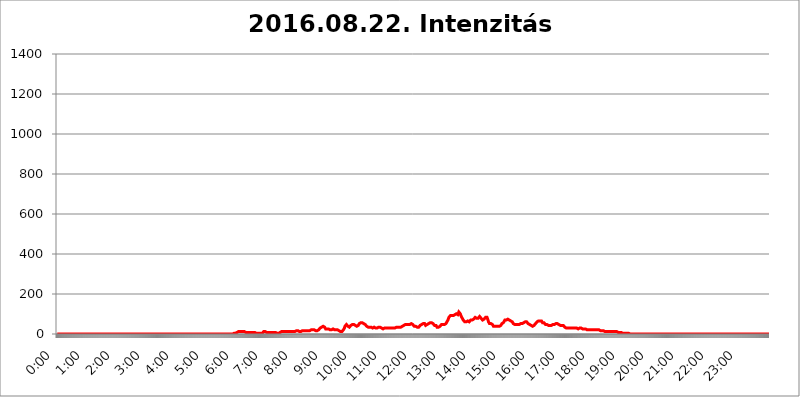
| Category | 2016.08.22. Intenzitás [W/m^2] |
|---|---|
| 0.0 | 0 |
| 0.0006944444444444445 | 0 |
| 0.001388888888888889 | 0 |
| 0.0020833333333333333 | 0 |
| 0.002777777777777778 | 0 |
| 0.003472222222222222 | 0 |
| 0.004166666666666667 | 0 |
| 0.004861111111111111 | 0 |
| 0.005555555555555556 | 0 |
| 0.0062499999999999995 | 0 |
| 0.006944444444444444 | 0 |
| 0.007638888888888889 | 0 |
| 0.008333333333333333 | 0 |
| 0.009027777777777779 | 0 |
| 0.009722222222222222 | 0 |
| 0.010416666666666666 | 0 |
| 0.011111111111111112 | 0 |
| 0.011805555555555555 | 0 |
| 0.012499999999999999 | 0 |
| 0.013194444444444444 | 0 |
| 0.013888888888888888 | 0 |
| 0.014583333333333332 | 0 |
| 0.015277777777777777 | 0 |
| 0.015972222222222224 | 0 |
| 0.016666666666666666 | 0 |
| 0.017361111111111112 | 0 |
| 0.018055555555555557 | 0 |
| 0.01875 | 0 |
| 0.019444444444444445 | 0 |
| 0.02013888888888889 | 0 |
| 0.020833333333333332 | 0 |
| 0.02152777777777778 | 0 |
| 0.022222222222222223 | 0 |
| 0.02291666666666667 | 0 |
| 0.02361111111111111 | 0 |
| 0.024305555555555556 | 0 |
| 0.024999999999999998 | 0 |
| 0.025694444444444447 | 0 |
| 0.02638888888888889 | 0 |
| 0.027083333333333334 | 0 |
| 0.027777777777777776 | 0 |
| 0.02847222222222222 | 0 |
| 0.029166666666666664 | 0 |
| 0.029861111111111113 | 0 |
| 0.030555555555555555 | 0 |
| 0.03125 | 0 |
| 0.03194444444444445 | 0 |
| 0.03263888888888889 | 0 |
| 0.03333333333333333 | 0 |
| 0.034027777777777775 | 0 |
| 0.034722222222222224 | 0 |
| 0.035416666666666666 | 0 |
| 0.036111111111111115 | 0 |
| 0.03680555555555556 | 0 |
| 0.0375 | 0 |
| 0.03819444444444444 | 0 |
| 0.03888888888888889 | 0 |
| 0.03958333333333333 | 0 |
| 0.04027777777777778 | 0 |
| 0.04097222222222222 | 0 |
| 0.041666666666666664 | 0 |
| 0.042361111111111106 | 0 |
| 0.04305555555555556 | 0 |
| 0.043750000000000004 | 0 |
| 0.044444444444444446 | 0 |
| 0.04513888888888889 | 0 |
| 0.04583333333333334 | 0 |
| 0.04652777777777778 | 0 |
| 0.04722222222222222 | 0 |
| 0.04791666666666666 | 0 |
| 0.04861111111111111 | 0 |
| 0.049305555555555554 | 0 |
| 0.049999999999999996 | 0 |
| 0.05069444444444445 | 0 |
| 0.051388888888888894 | 0 |
| 0.052083333333333336 | 0 |
| 0.05277777777777778 | 0 |
| 0.05347222222222222 | 0 |
| 0.05416666666666667 | 0 |
| 0.05486111111111111 | 0 |
| 0.05555555555555555 | 0 |
| 0.05625 | 0 |
| 0.05694444444444444 | 0 |
| 0.057638888888888885 | 0 |
| 0.05833333333333333 | 0 |
| 0.05902777777777778 | 0 |
| 0.059722222222222225 | 0 |
| 0.06041666666666667 | 0 |
| 0.061111111111111116 | 0 |
| 0.06180555555555556 | 0 |
| 0.0625 | 0 |
| 0.06319444444444444 | 0 |
| 0.06388888888888888 | 0 |
| 0.06458333333333334 | 0 |
| 0.06527777777777778 | 0 |
| 0.06597222222222222 | 0 |
| 0.06666666666666667 | 0 |
| 0.06736111111111111 | 0 |
| 0.06805555555555555 | 0 |
| 0.06874999999999999 | 0 |
| 0.06944444444444443 | 0 |
| 0.07013888888888889 | 0 |
| 0.07083333333333333 | 0 |
| 0.07152777777777779 | 0 |
| 0.07222222222222223 | 0 |
| 0.07291666666666667 | 0 |
| 0.07361111111111111 | 0 |
| 0.07430555555555556 | 0 |
| 0.075 | 0 |
| 0.07569444444444444 | 0 |
| 0.0763888888888889 | 0 |
| 0.07708333333333334 | 0 |
| 0.07777777777777778 | 0 |
| 0.07847222222222222 | 0 |
| 0.07916666666666666 | 0 |
| 0.0798611111111111 | 0 |
| 0.08055555555555556 | 0 |
| 0.08125 | 0 |
| 0.08194444444444444 | 0 |
| 0.08263888888888889 | 0 |
| 0.08333333333333333 | 0 |
| 0.08402777777777777 | 0 |
| 0.08472222222222221 | 0 |
| 0.08541666666666665 | 0 |
| 0.08611111111111112 | 0 |
| 0.08680555555555557 | 0 |
| 0.08750000000000001 | 0 |
| 0.08819444444444445 | 0 |
| 0.08888888888888889 | 0 |
| 0.08958333333333333 | 0 |
| 0.09027777777777778 | 0 |
| 0.09097222222222222 | 0 |
| 0.09166666666666667 | 0 |
| 0.09236111111111112 | 0 |
| 0.09305555555555556 | 0 |
| 0.09375 | 0 |
| 0.09444444444444444 | 0 |
| 0.09513888888888888 | 0 |
| 0.09583333333333333 | 0 |
| 0.09652777777777777 | 0 |
| 0.09722222222222222 | 0 |
| 0.09791666666666667 | 0 |
| 0.09861111111111111 | 0 |
| 0.09930555555555555 | 0 |
| 0.09999999999999999 | 0 |
| 0.10069444444444443 | 0 |
| 0.1013888888888889 | 0 |
| 0.10208333333333335 | 0 |
| 0.10277777777777779 | 0 |
| 0.10347222222222223 | 0 |
| 0.10416666666666667 | 0 |
| 0.10486111111111111 | 0 |
| 0.10555555555555556 | 0 |
| 0.10625 | 0 |
| 0.10694444444444444 | 0 |
| 0.1076388888888889 | 0 |
| 0.10833333333333334 | 0 |
| 0.10902777777777778 | 0 |
| 0.10972222222222222 | 0 |
| 0.1111111111111111 | 0 |
| 0.11180555555555556 | 0 |
| 0.11180555555555556 | 0 |
| 0.1125 | 0 |
| 0.11319444444444444 | 0 |
| 0.11388888888888889 | 0 |
| 0.11458333333333333 | 0 |
| 0.11527777777777777 | 0 |
| 0.11597222222222221 | 0 |
| 0.11666666666666665 | 0 |
| 0.1173611111111111 | 0 |
| 0.11805555555555557 | 0 |
| 0.11944444444444445 | 0 |
| 0.12013888888888889 | 0 |
| 0.12083333333333333 | 0 |
| 0.12152777777777778 | 0 |
| 0.12222222222222223 | 0 |
| 0.12291666666666667 | 0 |
| 0.12291666666666667 | 0 |
| 0.12361111111111112 | 0 |
| 0.12430555555555556 | 0 |
| 0.125 | 0 |
| 0.12569444444444444 | 0 |
| 0.12638888888888888 | 0 |
| 0.12708333333333333 | 0 |
| 0.16875 | 0 |
| 0.12847222222222224 | 0 |
| 0.12916666666666668 | 0 |
| 0.12986111111111112 | 0 |
| 0.13055555555555556 | 0 |
| 0.13125 | 0 |
| 0.13194444444444445 | 0 |
| 0.1326388888888889 | 0 |
| 0.13333333333333333 | 0 |
| 0.13402777777777777 | 0 |
| 0.13402777777777777 | 0 |
| 0.13472222222222222 | 0 |
| 0.13541666666666666 | 0 |
| 0.1361111111111111 | 0 |
| 0.13749999999999998 | 0 |
| 0.13819444444444443 | 0 |
| 0.1388888888888889 | 0 |
| 0.13958333333333334 | 0 |
| 0.14027777777777778 | 0 |
| 0.14097222222222222 | 0 |
| 0.14166666666666666 | 0 |
| 0.1423611111111111 | 0 |
| 0.14305555555555557 | 0 |
| 0.14375000000000002 | 0 |
| 0.14444444444444446 | 0 |
| 0.1451388888888889 | 0 |
| 0.1451388888888889 | 0 |
| 0.14652777777777778 | 0 |
| 0.14722222222222223 | 0 |
| 0.14791666666666667 | 0 |
| 0.1486111111111111 | 0 |
| 0.14930555555555555 | 0 |
| 0.15 | 0 |
| 0.15069444444444444 | 0 |
| 0.15138888888888888 | 0 |
| 0.15208333333333332 | 0 |
| 0.15277777777777776 | 0 |
| 0.15347222222222223 | 0 |
| 0.15416666666666667 | 0 |
| 0.15486111111111112 | 0 |
| 0.15555555555555556 | 0 |
| 0.15625 | 0 |
| 0.15694444444444444 | 0 |
| 0.15763888888888888 | 0 |
| 0.15833333333333333 | 0 |
| 0.15902777777777777 | 0 |
| 0.15972222222222224 | 0 |
| 0.16041666666666668 | 0 |
| 0.16111111111111112 | 0 |
| 0.16180555555555556 | 0 |
| 0.1625 | 0 |
| 0.16319444444444445 | 0 |
| 0.1638888888888889 | 0 |
| 0.16458333333333333 | 0 |
| 0.16527777777777777 | 0 |
| 0.16597222222222222 | 0 |
| 0.16666666666666666 | 0 |
| 0.1673611111111111 | 0 |
| 0.16805555555555554 | 0 |
| 0.16874999999999998 | 0 |
| 0.16944444444444443 | 0 |
| 0.17013888888888887 | 0 |
| 0.1708333333333333 | 0 |
| 0.17152777777777775 | 0 |
| 0.17222222222222225 | 0 |
| 0.1729166666666667 | 0 |
| 0.17361111111111113 | 0 |
| 0.17430555555555557 | 0 |
| 0.17500000000000002 | 0 |
| 0.17569444444444446 | 0 |
| 0.1763888888888889 | 0 |
| 0.17708333333333334 | 0 |
| 0.17777777777777778 | 0 |
| 0.17847222222222223 | 0 |
| 0.17916666666666667 | 0 |
| 0.1798611111111111 | 0 |
| 0.18055555555555555 | 0 |
| 0.18125 | 0 |
| 0.18194444444444444 | 0 |
| 0.1826388888888889 | 0 |
| 0.18333333333333335 | 0 |
| 0.1840277777777778 | 0 |
| 0.18472222222222223 | 0 |
| 0.18541666666666667 | 0 |
| 0.18611111111111112 | 0 |
| 0.18680555555555556 | 0 |
| 0.1875 | 0 |
| 0.18819444444444444 | 0 |
| 0.18888888888888888 | 0 |
| 0.18958333333333333 | 0 |
| 0.19027777777777777 | 0 |
| 0.1909722222222222 | 0 |
| 0.19166666666666665 | 0 |
| 0.19236111111111112 | 0 |
| 0.19305555555555554 | 0 |
| 0.19375 | 0 |
| 0.19444444444444445 | 0 |
| 0.1951388888888889 | 0 |
| 0.19583333333333333 | 0 |
| 0.19652777777777777 | 0 |
| 0.19722222222222222 | 0 |
| 0.19791666666666666 | 0 |
| 0.1986111111111111 | 0 |
| 0.19930555555555554 | 0 |
| 0.19999999999999998 | 0 |
| 0.20069444444444443 | 0 |
| 0.20138888888888887 | 0 |
| 0.2020833333333333 | 0 |
| 0.2027777777777778 | 0 |
| 0.2034722222222222 | 0 |
| 0.2041666666666667 | 0 |
| 0.20486111111111113 | 0 |
| 0.20555555555555557 | 0 |
| 0.20625000000000002 | 0 |
| 0.20694444444444446 | 0 |
| 0.2076388888888889 | 0 |
| 0.20833333333333334 | 0 |
| 0.20902777777777778 | 0 |
| 0.20972222222222223 | 0 |
| 0.21041666666666667 | 0 |
| 0.2111111111111111 | 0 |
| 0.21180555555555555 | 0 |
| 0.2125 | 0 |
| 0.21319444444444444 | 0 |
| 0.2138888888888889 | 0 |
| 0.21458333333333335 | 0 |
| 0.2152777777777778 | 0 |
| 0.21597222222222223 | 0 |
| 0.21666666666666667 | 0 |
| 0.21736111111111112 | 0 |
| 0.21805555555555556 | 0 |
| 0.21875 | 0 |
| 0.21944444444444444 | 0 |
| 0.22013888888888888 | 0 |
| 0.22083333333333333 | 0 |
| 0.22152777777777777 | 0 |
| 0.2222222222222222 | 0 |
| 0.22291666666666665 | 0 |
| 0.2236111111111111 | 0 |
| 0.22430555555555556 | 0 |
| 0.225 | 0 |
| 0.22569444444444445 | 0 |
| 0.2263888888888889 | 0 |
| 0.22708333333333333 | 0 |
| 0.22777777777777777 | 0 |
| 0.22847222222222222 | 0 |
| 0.22916666666666666 | 0 |
| 0.2298611111111111 | 0 |
| 0.23055555555555554 | 0 |
| 0.23124999999999998 | 0 |
| 0.23194444444444443 | 0 |
| 0.23263888888888887 | 0 |
| 0.2333333333333333 | 0 |
| 0.2340277777777778 | 0 |
| 0.2347222222222222 | 0 |
| 0.2354166666666667 | 0 |
| 0.23611111111111113 | 0 |
| 0.23680555555555557 | 0 |
| 0.23750000000000002 | 0 |
| 0.23819444444444446 | 0 |
| 0.2388888888888889 | 0 |
| 0.23958333333333334 | 0 |
| 0.24027777777777778 | 0 |
| 0.24097222222222223 | 0 |
| 0.24166666666666667 | 0 |
| 0.2423611111111111 | 0 |
| 0.24305555555555555 | 0 |
| 0.24375 | 0 |
| 0.24444444444444446 | 0 |
| 0.24513888888888888 | 0 |
| 0.24583333333333335 | 0 |
| 0.2465277777777778 | 3.525 |
| 0.24722222222222223 | 3.525 |
| 0.24791666666666667 | 3.525 |
| 0.24861111111111112 | 3.525 |
| 0.24930555555555556 | 3.525 |
| 0.25 | 3.525 |
| 0.25069444444444444 | 7.887 |
| 0.2513888888888889 | 7.887 |
| 0.2520833333333333 | 7.887 |
| 0.25277777777777777 | 7.887 |
| 0.2534722222222222 | 7.887 |
| 0.25416666666666665 | 12.257 |
| 0.2548611111111111 | 12.257 |
| 0.2555555555555556 | 12.257 |
| 0.25625000000000003 | 12.257 |
| 0.2569444444444445 | 12.257 |
| 0.2576388888888889 | 12.257 |
| 0.25833333333333336 | 12.257 |
| 0.2590277777777778 | 12.257 |
| 0.25972222222222224 | 12.257 |
| 0.2604166666666667 | 12.257 |
| 0.2611111111111111 | 12.257 |
| 0.26180555555555557 | 12.257 |
| 0.2625 | 12.257 |
| 0.26319444444444445 | 12.257 |
| 0.2638888888888889 | 7.887 |
| 0.26458333333333334 | 7.887 |
| 0.2652777777777778 | 7.887 |
| 0.2659722222222222 | 7.887 |
| 0.26666666666666666 | 7.887 |
| 0.2673611111111111 | 3.525 |
| 0.26805555555555555 | 7.887 |
| 0.26875 | 7.887 |
| 0.26944444444444443 | 7.887 |
| 0.2701388888888889 | 7.887 |
| 0.2708333333333333 | 7.887 |
| 0.27152777777777776 | 7.887 |
| 0.2722222222222222 | 7.887 |
| 0.27291666666666664 | 7.887 |
| 0.2736111111111111 | 7.887 |
| 0.2743055555555555 | 7.887 |
| 0.27499999999999997 | 7.887 |
| 0.27569444444444446 | 7.887 |
| 0.27638888888888885 | 7.887 |
| 0.27708333333333335 | 7.887 |
| 0.2777777777777778 | 7.887 |
| 0.27847222222222223 | 7.887 |
| 0.2791666666666667 | 3.525 |
| 0.2798611111111111 | 3.525 |
| 0.28055555555555556 | 3.525 |
| 0.28125 | 3.525 |
| 0.28194444444444444 | 3.525 |
| 0.2826388888888889 | 3.525 |
| 0.2833333333333333 | 3.525 |
| 0.28402777777777777 | 3.525 |
| 0.2847222222222222 | 3.525 |
| 0.28541666666666665 | 3.525 |
| 0.28611111111111115 | 3.525 |
| 0.28680555555555554 | 3.525 |
| 0.28750000000000003 | 3.525 |
| 0.2881944444444445 | 7.887 |
| 0.2888888888888889 | 7.887 |
| 0.28958333333333336 | 12.257 |
| 0.2902777777777778 | 12.257 |
| 0.29097222222222224 | 12.257 |
| 0.2916666666666667 | 12.257 |
| 0.2923611111111111 | 7.887 |
| 0.29305555555555557 | 7.887 |
| 0.29375 | 7.887 |
| 0.29444444444444445 | 7.887 |
| 0.2951388888888889 | 7.887 |
| 0.29583333333333334 | 7.887 |
| 0.2965277777777778 | 7.887 |
| 0.2972222222222222 | 7.887 |
| 0.29791666666666666 | 7.887 |
| 0.2986111111111111 | 3.525 |
| 0.29930555555555555 | 7.887 |
| 0.3 | 7.887 |
| 0.30069444444444443 | 7.887 |
| 0.3013888888888889 | 7.887 |
| 0.3020833333333333 | 7.887 |
| 0.30277777777777776 | 7.887 |
| 0.3034722222222222 | 7.887 |
| 0.30416666666666664 | 7.887 |
| 0.3048611111111111 | 7.887 |
| 0.3055555555555555 | 7.887 |
| 0.30624999999999997 | 7.887 |
| 0.3069444444444444 | 3.525 |
| 0.3076388888888889 | 3.525 |
| 0.30833333333333335 | 3.525 |
| 0.3090277777777778 | 3.525 |
| 0.30972222222222223 | 3.525 |
| 0.3104166666666667 | 3.525 |
| 0.3111111111111111 | 3.525 |
| 0.31180555555555556 | 7.887 |
| 0.3125 | 7.887 |
| 0.31319444444444444 | 7.887 |
| 0.3138888888888889 | 7.887 |
| 0.3145833333333333 | 12.257 |
| 0.31527777777777777 | 12.257 |
| 0.3159722222222222 | 12.257 |
| 0.31666666666666665 | 12.257 |
| 0.31736111111111115 | 12.257 |
| 0.31805555555555554 | 12.257 |
| 0.31875000000000003 | 12.257 |
| 0.3194444444444445 | 12.257 |
| 0.3201388888888889 | 12.257 |
| 0.32083333333333336 | 12.257 |
| 0.3215277777777778 | 12.257 |
| 0.32222222222222224 | 12.257 |
| 0.3229166666666667 | 12.257 |
| 0.3236111111111111 | 12.257 |
| 0.32430555555555557 | 12.257 |
| 0.325 | 12.257 |
| 0.32569444444444445 | 12.257 |
| 0.3263888888888889 | 12.257 |
| 0.32708333333333334 | 12.257 |
| 0.3277777777777778 | 12.257 |
| 0.3284722222222222 | 12.257 |
| 0.32916666666666666 | 12.257 |
| 0.3298611111111111 | 12.257 |
| 0.33055555555555555 | 12.257 |
| 0.33125 | 12.257 |
| 0.33194444444444443 | 12.257 |
| 0.3326388888888889 | 12.257 |
| 0.3333333333333333 | 12.257 |
| 0.3340277777777778 | 12.257 |
| 0.3347222222222222 | 12.257 |
| 0.3354166666666667 | 16.636 |
| 0.3361111111111111 | 16.636 |
| 0.3368055555555556 | 16.636 |
| 0.33749999999999997 | 16.636 |
| 0.33819444444444446 | 16.636 |
| 0.33888888888888885 | 12.257 |
| 0.33958333333333335 | 12.257 |
| 0.34027777777777773 | 12.257 |
| 0.34097222222222223 | 12.257 |
| 0.3416666666666666 | 12.257 |
| 0.3423611111111111 | 12.257 |
| 0.3430555555555555 | 16.636 |
| 0.34375 | 16.636 |
| 0.3444444444444445 | 16.636 |
| 0.3451388888888889 | 16.636 |
| 0.3458333333333334 | 16.636 |
| 0.34652777777777777 | 16.636 |
| 0.34722222222222227 | 16.636 |
| 0.34791666666666665 | 16.636 |
| 0.34861111111111115 | 16.636 |
| 0.34930555555555554 | 16.636 |
| 0.35000000000000003 | 16.636 |
| 0.3506944444444444 | 16.636 |
| 0.3513888888888889 | 16.636 |
| 0.3520833333333333 | 16.636 |
| 0.3527777777777778 | 16.636 |
| 0.3534722222222222 | 16.636 |
| 0.3541666666666667 | 16.636 |
| 0.3548611111111111 | 16.636 |
| 0.35555555555555557 | 21.024 |
| 0.35625 | 21.024 |
| 0.35694444444444445 | 21.024 |
| 0.3576388888888889 | 21.024 |
| 0.35833333333333334 | 21.024 |
| 0.3590277777777778 | 21.024 |
| 0.3597222222222222 | 21.024 |
| 0.36041666666666666 | 21.024 |
| 0.3611111111111111 | 21.024 |
| 0.36180555555555555 | 21.024 |
| 0.3625 | 16.636 |
| 0.36319444444444443 | 16.636 |
| 0.3638888888888889 | 16.636 |
| 0.3645833333333333 | 16.636 |
| 0.3652777777777778 | 16.636 |
| 0.3659722222222222 | 21.024 |
| 0.3666666666666667 | 21.024 |
| 0.3673611111111111 | 25.419 |
| 0.3680555555555556 | 25.419 |
| 0.36874999999999997 | 29.823 |
| 0.36944444444444446 | 29.823 |
| 0.37013888888888885 | 29.823 |
| 0.37083333333333335 | 34.234 |
| 0.37152777777777773 | 34.234 |
| 0.37222222222222223 | 34.234 |
| 0.3729166666666666 | 38.653 |
| 0.3736111111111111 | 38.653 |
| 0.3743055555555555 | 34.234 |
| 0.375 | 34.234 |
| 0.3756944444444445 | 29.823 |
| 0.3763888888888889 | 25.419 |
| 0.3770833333333334 | 25.419 |
| 0.37777777777777777 | 25.419 |
| 0.37847222222222227 | 25.419 |
| 0.37916666666666665 | 25.419 |
| 0.37986111111111115 | 25.419 |
| 0.38055555555555554 | 25.419 |
| 0.38125000000000003 | 21.024 |
| 0.3819444444444444 | 21.024 |
| 0.3826388888888889 | 21.024 |
| 0.3833333333333333 | 21.024 |
| 0.3840277777777778 | 21.024 |
| 0.3847222222222222 | 21.024 |
| 0.3854166666666667 | 25.419 |
| 0.3861111111111111 | 25.419 |
| 0.38680555555555557 | 25.419 |
| 0.3875 | 25.419 |
| 0.38819444444444445 | 21.024 |
| 0.3888888888888889 | 21.024 |
| 0.38958333333333334 | 21.024 |
| 0.3902777777777778 | 21.024 |
| 0.3909722222222222 | 21.024 |
| 0.39166666666666666 | 21.024 |
| 0.3923611111111111 | 21.024 |
| 0.39305555555555555 | 21.024 |
| 0.39375 | 16.636 |
| 0.39444444444444443 | 21.024 |
| 0.3951388888888889 | 16.636 |
| 0.3958333333333333 | 16.636 |
| 0.3965277777777778 | 16.636 |
| 0.3972222222222222 | 12.257 |
| 0.3979166666666667 | 12.257 |
| 0.3986111111111111 | 12.257 |
| 0.3993055555555556 | 12.257 |
| 0.39999999999999997 | 16.636 |
| 0.40069444444444446 | 16.636 |
| 0.40138888888888885 | 21.024 |
| 0.40208333333333335 | 25.419 |
| 0.40277777777777773 | 29.823 |
| 0.40347222222222223 | 38.653 |
| 0.4041666666666666 | 38.653 |
| 0.4048611111111111 | 43.079 |
| 0.4055555555555555 | 47.511 |
| 0.40625 | 47.511 |
| 0.4069444444444445 | 43.079 |
| 0.4076388888888889 | 38.653 |
| 0.4083333333333334 | 38.653 |
| 0.40902777777777777 | 38.653 |
| 0.40972222222222227 | 34.234 |
| 0.41041666666666665 | 34.234 |
| 0.41111111111111115 | 38.653 |
| 0.41180555555555554 | 43.079 |
| 0.41250000000000003 | 43.079 |
| 0.4131944444444444 | 47.511 |
| 0.4138888888888889 | 47.511 |
| 0.4145833333333333 | 47.511 |
| 0.4152777777777778 | 47.511 |
| 0.4159722222222222 | 47.511 |
| 0.4166666666666667 | 43.079 |
| 0.4173611111111111 | 43.079 |
| 0.41805555555555557 | 43.079 |
| 0.41875 | 38.653 |
| 0.41944444444444445 | 38.653 |
| 0.4201388888888889 | 38.653 |
| 0.42083333333333334 | 38.653 |
| 0.4215277777777778 | 43.079 |
| 0.4222222222222222 | 43.079 |
| 0.42291666666666666 | 47.511 |
| 0.4236111111111111 | 51.951 |
| 0.42430555555555555 | 56.398 |
| 0.425 | 56.398 |
| 0.42569444444444443 | 56.398 |
| 0.4263888888888889 | 56.398 |
| 0.4270833333333333 | 56.398 |
| 0.4277777777777778 | 56.398 |
| 0.4284722222222222 | 56.398 |
| 0.4291666666666667 | 51.951 |
| 0.4298611111111111 | 51.951 |
| 0.4305555555555556 | 51.951 |
| 0.43124999999999997 | 47.511 |
| 0.43194444444444446 | 47.511 |
| 0.43263888888888885 | 47.511 |
| 0.43333333333333335 | 43.079 |
| 0.43402777777777773 | 38.653 |
| 0.43472222222222223 | 38.653 |
| 0.4354166666666666 | 34.234 |
| 0.4361111111111111 | 34.234 |
| 0.4368055555555555 | 34.234 |
| 0.4375 | 34.234 |
| 0.4381944444444445 | 34.234 |
| 0.4388888888888889 | 34.234 |
| 0.4395833333333334 | 34.234 |
| 0.44027777777777777 | 34.234 |
| 0.44097222222222227 | 29.823 |
| 0.44166666666666665 | 29.823 |
| 0.44236111111111115 | 29.823 |
| 0.44305555555555554 | 34.234 |
| 0.44375000000000003 | 34.234 |
| 0.4444444444444444 | 34.234 |
| 0.4451388888888889 | 34.234 |
| 0.4458333333333333 | 29.823 |
| 0.4465277777777778 | 29.823 |
| 0.4472222222222222 | 29.823 |
| 0.4479166666666667 | 29.823 |
| 0.4486111111111111 | 29.823 |
| 0.44930555555555557 | 29.823 |
| 0.45 | 34.234 |
| 0.45069444444444445 | 34.234 |
| 0.4513888888888889 | 34.234 |
| 0.45208333333333334 | 34.234 |
| 0.4527777777777778 | 34.234 |
| 0.4534722222222222 | 29.823 |
| 0.45416666666666666 | 29.823 |
| 0.4548611111111111 | 29.823 |
| 0.45555555555555555 | 29.823 |
| 0.45625 | 25.419 |
| 0.45694444444444443 | 25.419 |
| 0.4576388888888889 | 25.419 |
| 0.4583333333333333 | 25.419 |
| 0.4590277777777778 | 29.823 |
| 0.4597222222222222 | 29.823 |
| 0.4604166666666667 | 29.823 |
| 0.4611111111111111 | 29.823 |
| 0.4618055555555556 | 29.823 |
| 0.46249999999999997 | 29.823 |
| 0.46319444444444446 | 29.823 |
| 0.46388888888888885 | 29.823 |
| 0.46458333333333335 | 29.823 |
| 0.46527777777777773 | 29.823 |
| 0.46597222222222223 | 29.823 |
| 0.4666666666666666 | 29.823 |
| 0.4673611111111111 | 29.823 |
| 0.4680555555555555 | 29.823 |
| 0.46875 | 29.823 |
| 0.4694444444444445 | 29.823 |
| 0.4701388888888889 | 29.823 |
| 0.4708333333333334 | 29.823 |
| 0.47152777777777777 | 29.823 |
| 0.47222222222222227 | 29.823 |
| 0.47291666666666665 | 29.823 |
| 0.47361111111111115 | 29.823 |
| 0.47430555555555554 | 34.234 |
| 0.47500000000000003 | 34.234 |
| 0.4756944444444444 | 34.234 |
| 0.4763888888888889 | 34.234 |
| 0.4770833333333333 | 34.234 |
| 0.4777777777777778 | 34.234 |
| 0.4784722222222222 | 34.234 |
| 0.4791666666666667 | 34.234 |
| 0.4798611111111111 | 34.234 |
| 0.48055555555555557 | 34.234 |
| 0.48125 | 34.234 |
| 0.48194444444444445 | 34.234 |
| 0.4826388888888889 | 38.653 |
| 0.48333333333333334 | 38.653 |
| 0.4840277777777778 | 38.653 |
| 0.4847222222222222 | 43.079 |
| 0.48541666666666666 | 43.079 |
| 0.4861111111111111 | 43.079 |
| 0.48680555555555555 | 47.511 |
| 0.4875 | 47.511 |
| 0.48819444444444443 | 47.511 |
| 0.4888888888888889 | 51.951 |
| 0.4895833333333333 | 51.951 |
| 0.4902777777777778 | 47.511 |
| 0.4909722222222222 | 47.511 |
| 0.4916666666666667 | 47.511 |
| 0.4923611111111111 | 47.511 |
| 0.4930555555555556 | 47.511 |
| 0.49374999999999997 | 47.511 |
| 0.49444444444444446 | 47.511 |
| 0.49513888888888885 | 47.511 |
| 0.49583333333333335 | 51.951 |
| 0.49652777777777773 | 51.951 |
| 0.49722222222222223 | 47.511 |
| 0.4979166666666666 | 47.511 |
| 0.4986111111111111 | 47.511 |
| 0.4993055555555555 | 43.079 |
| 0.5 | 43.079 |
| 0.5006944444444444 | 38.653 |
| 0.5013888888888889 | 38.653 |
| 0.5020833333333333 | 38.653 |
| 0.5027777777777778 | 38.653 |
| 0.5034722222222222 | 34.234 |
| 0.5041666666666667 | 34.234 |
| 0.5048611111111111 | 34.234 |
| 0.5055555555555555 | 34.234 |
| 0.50625 | 34.234 |
| 0.5069444444444444 | 34.234 |
| 0.5076388888888889 | 38.653 |
| 0.5083333333333333 | 38.653 |
| 0.5090277777777777 | 43.079 |
| 0.5097222222222222 | 43.079 |
| 0.5104166666666666 | 43.079 |
| 0.5111111111111112 | 47.511 |
| 0.5118055555555555 | 47.511 |
| 0.5125000000000001 | 51.951 |
| 0.5131944444444444 | 51.951 |
| 0.513888888888889 | 56.398 |
| 0.5145833333333333 | 56.398 |
| 0.5152777777777778 | 51.951 |
| 0.5159722222222222 | 47.511 |
| 0.5166666666666667 | 43.079 |
| 0.517361111111111 | 43.079 |
| 0.5180555555555556 | 47.511 |
| 0.5187499999999999 | 47.511 |
| 0.5194444444444445 | 47.511 |
| 0.5201388888888888 | 47.511 |
| 0.5208333333333334 | 51.951 |
| 0.5215277777777778 | 56.398 |
| 0.5222222222222223 | 56.398 |
| 0.5229166666666667 | 56.398 |
| 0.5236111111111111 | 60.85 |
| 0.5243055555555556 | 60.85 |
| 0.525 | 56.398 |
| 0.5256944444444445 | 56.398 |
| 0.5263888888888889 | 51.951 |
| 0.5270833333333333 | 51.951 |
| 0.5277777777777778 | 47.511 |
| 0.5284722222222222 | 47.511 |
| 0.5291666666666667 | 43.079 |
| 0.5298611111111111 | 47.511 |
| 0.5305555555555556 | 43.079 |
| 0.53125 | 43.079 |
| 0.5319444444444444 | 38.653 |
| 0.5326388888888889 | 34.234 |
| 0.5333333333333333 | 34.234 |
| 0.5340277777777778 | 34.234 |
| 0.5347222222222222 | 34.234 |
| 0.5354166666666667 | 34.234 |
| 0.5361111111111111 | 38.653 |
| 0.5368055555555555 | 38.653 |
| 0.5375 | 38.653 |
| 0.5381944444444444 | 43.079 |
| 0.5388888888888889 | 47.511 |
| 0.5395833333333333 | 47.511 |
| 0.5402777777777777 | 47.511 |
| 0.5409722222222222 | 47.511 |
| 0.5416666666666666 | 47.511 |
| 0.5423611111111112 | 47.511 |
| 0.5430555555555555 | 47.511 |
| 0.5437500000000001 | 47.511 |
| 0.5444444444444444 | 51.951 |
| 0.545138888888889 | 51.951 |
| 0.5458333333333333 | 56.398 |
| 0.5465277777777778 | 60.85 |
| 0.5472222222222222 | 65.31 |
| 0.5479166666666667 | 69.775 |
| 0.548611111111111 | 74.246 |
| 0.5493055555555556 | 83.205 |
| 0.5499999999999999 | 87.692 |
| 0.5506944444444445 | 87.692 |
| 0.5513888888888888 | 92.184 |
| 0.5520833333333334 | 92.184 |
| 0.5527777777777778 | 92.184 |
| 0.5534722222222223 | 92.184 |
| 0.5541666666666667 | 92.184 |
| 0.5548611111111111 | 92.184 |
| 0.5555555555555556 | 92.184 |
| 0.55625 | 92.184 |
| 0.5569444444444445 | 92.184 |
| 0.5576388888888889 | 96.682 |
| 0.5583333333333333 | 101.184 |
| 0.5590277777777778 | 101.184 |
| 0.5597222222222222 | 101.184 |
| 0.5604166666666667 | 101.184 |
| 0.5611111111111111 | 96.682 |
| 0.5618055555555556 | 96.682 |
| 0.5625 | 101.184 |
| 0.5631944444444444 | 110.201 |
| 0.5638888888888889 | 110.201 |
| 0.5645833333333333 | 105.69 |
| 0.5652777777777778 | 101.184 |
| 0.5659722222222222 | 96.682 |
| 0.5666666666666667 | 87.692 |
| 0.5673611111111111 | 83.205 |
| 0.5680555555555555 | 78.722 |
| 0.56875 | 74.246 |
| 0.5694444444444444 | 69.775 |
| 0.5701388888888889 | 65.31 |
| 0.5708333333333333 | 65.31 |
| 0.5715277777777777 | 60.85 |
| 0.5722222222222222 | 60.85 |
| 0.5729166666666666 | 60.85 |
| 0.5736111111111112 | 60.85 |
| 0.5743055555555555 | 60.85 |
| 0.5750000000000001 | 60.85 |
| 0.5756944444444444 | 65.31 |
| 0.576388888888889 | 65.31 |
| 0.5770833333333333 | 65.31 |
| 0.5777777777777778 | 60.85 |
| 0.5784722222222222 | 65.31 |
| 0.5791666666666667 | 65.31 |
| 0.579861111111111 | 69.775 |
| 0.5805555555555556 | 69.775 |
| 0.5812499999999999 | 69.775 |
| 0.5819444444444445 | 69.775 |
| 0.5826388888888888 | 69.775 |
| 0.5833333333333334 | 74.246 |
| 0.5840277777777778 | 74.246 |
| 0.5847222222222223 | 74.246 |
| 0.5854166666666667 | 78.722 |
| 0.5861111111111111 | 83.205 |
| 0.5868055555555556 | 83.205 |
| 0.5875 | 83.205 |
| 0.5881944444444445 | 78.722 |
| 0.5888888888888889 | 74.246 |
| 0.5895833333333333 | 78.722 |
| 0.5902777777777778 | 78.722 |
| 0.5909722222222222 | 83.205 |
| 0.5916666666666667 | 83.205 |
| 0.5923611111111111 | 87.692 |
| 0.5930555555555556 | 83.205 |
| 0.59375 | 83.205 |
| 0.5944444444444444 | 78.722 |
| 0.5951388888888889 | 74.246 |
| 0.5958333333333333 | 74.246 |
| 0.5965277777777778 | 69.775 |
| 0.5972222222222222 | 74.246 |
| 0.5979166666666667 | 69.775 |
| 0.5986111111111111 | 74.246 |
| 0.5993055555555555 | 74.246 |
| 0.6 | 78.722 |
| 0.6006944444444444 | 83.205 |
| 0.6013888888888889 | 87.692 |
| 0.6020833333333333 | 87.692 |
| 0.6027777777777777 | 83.205 |
| 0.6034722222222222 | 78.722 |
| 0.6041666666666666 | 69.775 |
| 0.6048611111111112 | 60.85 |
| 0.6055555555555555 | 56.398 |
| 0.6062500000000001 | 51.951 |
| 0.6069444444444444 | 51.951 |
| 0.607638888888889 | 51.951 |
| 0.6083333333333333 | 51.951 |
| 0.6090277777777778 | 51.951 |
| 0.6097222222222222 | 47.511 |
| 0.6104166666666667 | 47.511 |
| 0.611111111111111 | 47.511 |
| 0.6118055555555556 | 38.653 |
| 0.6124999999999999 | 38.653 |
| 0.6131944444444445 | 38.653 |
| 0.6138888888888888 | 38.653 |
| 0.6145833333333334 | 38.653 |
| 0.6152777777777778 | 38.653 |
| 0.6159722222222223 | 38.653 |
| 0.6166666666666667 | 38.653 |
| 0.6173611111111111 | 38.653 |
| 0.6180555555555556 | 38.653 |
| 0.61875 | 38.653 |
| 0.6194444444444445 | 38.653 |
| 0.6201388888888889 | 38.653 |
| 0.6208333333333333 | 43.079 |
| 0.6215277777777778 | 43.079 |
| 0.6222222222222222 | 43.079 |
| 0.6229166666666667 | 47.511 |
| 0.6236111111111111 | 51.951 |
| 0.6243055555555556 | 51.951 |
| 0.625 | 56.398 |
| 0.6256944444444444 | 56.398 |
| 0.6263888888888889 | 60.85 |
| 0.6270833333333333 | 60.85 |
| 0.6277777777777778 | 69.775 |
| 0.6284722222222222 | 65.31 |
| 0.6291666666666667 | 65.31 |
| 0.6298611111111111 | 69.775 |
| 0.6305555555555555 | 69.775 |
| 0.63125 | 74.246 |
| 0.6319444444444444 | 74.246 |
| 0.6326388888888889 | 74.246 |
| 0.6333333333333333 | 69.775 |
| 0.6340277777777777 | 69.775 |
| 0.6347222222222222 | 69.775 |
| 0.6354166666666666 | 65.31 |
| 0.6361111111111112 | 65.31 |
| 0.6368055555555555 | 65.31 |
| 0.6375000000000001 | 60.85 |
| 0.6381944444444444 | 60.85 |
| 0.638888888888889 | 56.398 |
| 0.6395833333333333 | 51.951 |
| 0.6402777777777778 | 51.951 |
| 0.6409722222222222 | 47.511 |
| 0.6416666666666667 | 47.511 |
| 0.642361111111111 | 47.511 |
| 0.6430555555555556 | 47.511 |
| 0.6437499999999999 | 47.511 |
| 0.6444444444444445 | 43.079 |
| 0.6451388888888888 | 43.079 |
| 0.6458333333333334 | 47.511 |
| 0.6465277777777778 | 47.511 |
| 0.6472222222222223 | 47.511 |
| 0.6479166666666667 | 47.511 |
| 0.6486111111111111 | 51.951 |
| 0.6493055555555556 | 51.951 |
| 0.65 | 51.951 |
| 0.6506944444444445 | 56.398 |
| 0.6513888888888889 | 51.951 |
| 0.6520833333333333 | 51.951 |
| 0.6527777777777778 | 51.951 |
| 0.6534722222222222 | 51.951 |
| 0.6541666666666667 | 56.398 |
| 0.6548611111111111 | 56.398 |
| 0.6555555555555556 | 60.85 |
| 0.65625 | 60.85 |
| 0.6569444444444444 | 60.85 |
| 0.6576388888888889 | 65.31 |
| 0.6583333333333333 | 60.85 |
| 0.6590277777777778 | 56.398 |
| 0.6597222222222222 | 56.398 |
| 0.6604166666666667 | 51.951 |
| 0.6611111111111111 | 51.951 |
| 0.6618055555555555 | 47.511 |
| 0.6625 | 47.511 |
| 0.6631944444444444 | 47.511 |
| 0.6638888888888889 | 43.079 |
| 0.6645833333333333 | 43.079 |
| 0.6652777777777777 | 43.079 |
| 0.6659722222222222 | 43.079 |
| 0.6666666666666666 | 38.653 |
| 0.6673611111111111 | 43.079 |
| 0.6680555555555556 | 38.653 |
| 0.6687500000000001 | 43.079 |
| 0.6694444444444444 | 47.511 |
| 0.6701388888888888 | 47.511 |
| 0.6708333333333334 | 51.951 |
| 0.6715277777777778 | 51.951 |
| 0.6722222222222222 | 56.398 |
| 0.6729166666666666 | 60.85 |
| 0.6736111111111112 | 60.85 |
| 0.6743055555555556 | 65.31 |
| 0.6749999999999999 | 65.31 |
| 0.6756944444444444 | 65.31 |
| 0.6763888888888889 | 65.31 |
| 0.6770833333333334 | 65.31 |
| 0.6777777777777777 | 65.31 |
| 0.6784722222222223 | 65.31 |
| 0.6791666666666667 | 65.31 |
| 0.6798611111111111 | 60.85 |
| 0.6805555555555555 | 56.398 |
| 0.68125 | 56.398 |
| 0.6819444444444445 | 56.398 |
| 0.6826388888888889 | 56.398 |
| 0.6833333333333332 | 56.398 |
| 0.6840277777777778 | 51.951 |
| 0.6847222222222222 | 47.511 |
| 0.6854166666666667 | 47.511 |
| 0.686111111111111 | 47.511 |
| 0.6868055555555556 | 47.511 |
| 0.6875 | 47.511 |
| 0.6881944444444444 | 43.079 |
| 0.688888888888889 | 43.079 |
| 0.6895833333333333 | 43.079 |
| 0.6902777777777778 | 38.653 |
| 0.6909722222222222 | 43.079 |
| 0.6916666666666668 | 43.079 |
| 0.6923611111111111 | 43.079 |
| 0.6930555555555555 | 43.079 |
| 0.69375 | 43.079 |
| 0.6944444444444445 | 47.511 |
| 0.6951388888888889 | 47.511 |
| 0.6958333333333333 | 47.511 |
| 0.6965277777777777 | 47.511 |
| 0.6972222222222223 | 47.511 |
| 0.6979166666666666 | 47.511 |
| 0.6986111111111111 | 51.951 |
| 0.6993055555555556 | 51.951 |
| 0.7000000000000001 | 51.951 |
| 0.7006944444444444 | 51.951 |
| 0.7013888888888888 | 51.951 |
| 0.7020833333333334 | 47.511 |
| 0.7027777777777778 | 47.511 |
| 0.7034722222222222 | 47.511 |
| 0.7041666666666666 | 43.079 |
| 0.7048611111111112 | 43.079 |
| 0.7055555555555556 | 43.079 |
| 0.7062499999999999 | 43.079 |
| 0.7069444444444444 | 43.079 |
| 0.7076388888888889 | 43.079 |
| 0.7083333333333334 | 43.079 |
| 0.7090277777777777 | 43.079 |
| 0.7097222222222223 | 43.079 |
| 0.7104166666666667 | 38.653 |
| 0.7111111111111111 | 38.653 |
| 0.7118055555555555 | 34.234 |
| 0.7125 | 34.234 |
| 0.7131944444444445 | 34.234 |
| 0.7138888888888889 | 29.823 |
| 0.7145833333333332 | 29.823 |
| 0.7152777777777778 | 29.823 |
| 0.7159722222222222 | 29.823 |
| 0.7166666666666667 | 29.823 |
| 0.717361111111111 | 29.823 |
| 0.7180555555555556 | 29.823 |
| 0.71875 | 29.823 |
| 0.7194444444444444 | 29.823 |
| 0.720138888888889 | 29.823 |
| 0.7208333333333333 | 29.823 |
| 0.7215277777777778 | 29.823 |
| 0.7222222222222222 | 29.823 |
| 0.7229166666666668 | 29.823 |
| 0.7236111111111111 | 29.823 |
| 0.7243055555555555 | 29.823 |
| 0.725 | 29.823 |
| 0.7256944444444445 | 29.823 |
| 0.7263888888888889 | 29.823 |
| 0.7270833333333333 | 29.823 |
| 0.7277777777777777 | 29.823 |
| 0.7284722222222223 | 29.823 |
| 0.7291666666666666 | 25.419 |
| 0.7298611111111111 | 25.419 |
| 0.7305555555555556 | 25.419 |
| 0.7312500000000001 | 25.419 |
| 0.7319444444444444 | 25.419 |
| 0.7326388888888888 | 29.823 |
| 0.7333333333333334 | 29.823 |
| 0.7340277777777778 | 29.823 |
| 0.7347222222222222 | 29.823 |
| 0.7354166666666666 | 25.419 |
| 0.7361111111111112 | 25.419 |
| 0.7368055555555556 | 25.419 |
| 0.7374999999999999 | 25.419 |
| 0.7381944444444444 | 25.419 |
| 0.7388888888888889 | 25.419 |
| 0.7395833333333334 | 25.419 |
| 0.7402777777777777 | 25.419 |
| 0.7409722222222223 | 25.419 |
| 0.7416666666666667 | 25.419 |
| 0.7423611111111111 | 21.024 |
| 0.7430555555555555 | 21.024 |
| 0.74375 | 21.024 |
| 0.7444444444444445 | 21.024 |
| 0.7451388888888889 | 21.024 |
| 0.7458333333333332 | 21.024 |
| 0.7465277777777778 | 21.024 |
| 0.7472222222222222 | 21.024 |
| 0.7479166666666667 | 21.024 |
| 0.748611111111111 | 21.024 |
| 0.7493055555555556 | 21.024 |
| 0.75 | 21.024 |
| 0.7506944444444444 | 21.024 |
| 0.751388888888889 | 21.024 |
| 0.7520833333333333 | 21.024 |
| 0.7527777777777778 | 21.024 |
| 0.7534722222222222 | 21.024 |
| 0.7541666666666668 | 21.024 |
| 0.7548611111111111 | 21.024 |
| 0.7555555555555555 | 21.024 |
| 0.75625 | 21.024 |
| 0.7569444444444445 | 21.024 |
| 0.7576388888888889 | 21.024 |
| 0.7583333333333333 | 21.024 |
| 0.7590277777777777 | 21.024 |
| 0.7597222222222223 | 21.024 |
| 0.7604166666666666 | 21.024 |
| 0.7611111111111111 | 16.636 |
| 0.7618055555555556 | 16.636 |
| 0.7625000000000001 | 16.636 |
| 0.7631944444444444 | 16.636 |
| 0.7638888888888888 | 16.636 |
| 0.7645833333333334 | 16.636 |
| 0.7652777777777778 | 16.636 |
| 0.7659722222222222 | 16.636 |
| 0.7666666666666666 | 16.636 |
| 0.7673611111111112 | 12.257 |
| 0.7680555555555556 | 12.257 |
| 0.7687499999999999 | 12.257 |
| 0.7694444444444444 | 12.257 |
| 0.7701388888888889 | 12.257 |
| 0.7708333333333334 | 12.257 |
| 0.7715277777777777 | 12.257 |
| 0.7722222222222223 | 12.257 |
| 0.7729166666666667 | 12.257 |
| 0.7736111111111111 | 12.257 |
| 0.7743055555555555 | 12.257 |
| 0.775 | 12.257 |
| 0.7756944444444445 | 12.257 |
| 0.7763888888888889 | 12.257 |
| 0.7770833333333332 | 12.257 |
| 0.7777777777777778 | 12.257 |
| 0.7784722222222222 | 12.257 |
| 0.7791666666666667 | 12.257 |
| 0.779861111111111 | 12.257 |
| 0.7805555555555556 | 12.257 |
| 0.78125 | 12.257 |
| 0.7819444444444444 | 12.257 |
| 0.782638888888889 | 12.257 |
| 0.7833333333333333 | 12.257 |
| 0.7840277777777778 | 12.257 |
| 0.7847222222222222 | 12.257 |
| 0.7854166666666668 | 12.257 |
| 0.7861111111111111 | 7.887 |
| 0.7868055555555555 | 7.887 |
| 0.7875 | 7.887 |
| 0.7881944444444445 | 7.887 |
| 0.7888888888888889 | 7.887 |
| 0.7895833333333333 | 7.887 |
| 0.7902777777777777 | 3.525 |
| 0.7909722222222223 | 7.887 |
| 0.7916666666666666 | 3.525 |
| 0.7923611111111111 | 3.525 |
| 0.7930555555555556 | 3.525 |
| 0.7937500000000001 | 3.525 |
| 0.7944444444444444 | 3.525 |
| 0.7951388888888888 | 3.525 |
| 0.7958333333333334 | 3.525 |
| 0.7965277777777778 | 3.525 |
| 0.7972222222222222 | 3.525 |
| 0.7979166666666666 | 3.525 |
| 0.7986111111111112 | 3.525 |
| 0.7993055555555556 | 3.525 |
| 0.7999999999999999 | 3.525 |
| 0.8006944444444444 | 3.525 |
| 0.8013888888888889 | 3.525 |
| 0.8020833333333334 | 3.525 |
| 0.8027777777777777 | 0 |
| 0.8034722222222223 | 0 |
| 0.8041666666666667 | 0 |
| 0.8048611111111111 | 0 |
| 0.8055555555555555 | 0 |
| 0.80625 | 0 |
| 0.8069444444444445 | 0 |
| 0.8076388888888889 | 0 |
| 0.8083333333333332 | 0 |
| 0.8090277777777778 | 0 |
| 0.8097222222222222 | 0 |
| 0.8104166666666667 | 0 |
| 0.811111111111111 | 0 |
| 0.8118055555555556 | 0 |
| 0.8125 | 0 |
| 0.8131944444444444 | 0 |
| 0.813888888888889 | 0 |
| 0.8145833333333333 | 0 |
| 0.8152777777777778 | 0 |
| 0.8159722222222222 | 0 |
| 0.8166666666666668 | 0 |
| 0.8173611111111111 | 0 |
| 0.8180555555555555 | 0 |
| 0.81875 | 0 |
| 0.8194444444444445 | 0 |
| 0.8201388888888889 | 0 |
| 0.8208333333333333 | 0 |
| 0.8215277777777777 | 0 |
| 0.8222222222222223 | 0 |
| 0.8229166666666666 | 0 |
| 0.8236111111111111 | 0 |
| 0.8243055555555556 | 0 |
| 0.8250000000000001 | 0 |
| 0.8256944444444444 | 0 |
| 0.8263888888888888 | 0 |
| 0.8270833333333334 | 0 |
| 0.8277777777777778 | 0 |
| 0.8284722222222222 | 0 |
| 0.8291666666666666 | 0 |
| 0.8298611111111112 | 0 |
| 0.8305555555555556 | 0 |
| 0.8312499999999999 | 0 |
| 0.8319444444444444 | 0 |
| 0.8326388888888889 | 0 |
| 0.8333333333333334 | 0 |
| 0.8340277777777777 | 0 |
| 0.8347222222222223 | 0 |
| 0.8354166666666667 | 0 |
| 0.8361111111111111 | 0 |
| 0.8368055555555555 | 0 |
| 0.8375 | 0 |
| 0.8381944444444445 | 0 |
| 0.8388888888888889 | 0 |
| 0.8395833333333332 | 0 |
| 0.8402777777777778 | 0 |
| 0.8409722222222222 | 0 |
| 0.8416666666666667 | 0 |
| 0.842361111111111 | 0 |
| 0.8430555555555556 | 0 |
| 0.84375 | 0 |
| 0.8444444444444444 | 0 |
| 0.845138888888889 | 0 |
| 0.8458333333333333 | 0 |
| 0.8465277777777778 | 0 |
| 0.8472222222222222 | 0 |
| 0.8479166666666668 | 0 |
| 0.8486111111111111 | 0 |
| 0.8493055555555555 | 0 |
| 0.85 | 0 |
| 0.8506944444444445 | 0 |
| 0.8513888888888889 | 0 |
| 0.8520833333333333 | 0 |
| 0.8527777777777777 | 0 |
| 0.8534722222222223 | 0 |
| 0.8541666666666666 | 0 |
| 0.8548611111111111 | 0 |
| 0.8555555555555556 | 0 |
| 0.8562500000000001 | 0 |
| 0.8569444444444444 | 0 |
| 0.8576388888888888 | 0 |
| 0.8583333333333334 | 0 |
| 0.8590277777777778 | 0 |
| 0.8597222222222222 | 0 |
| 0.8604166666666666 | 0 |
| 0.8611111111111112 | 0 |
| 0.8618055555555556 | 0 |
| 0.8624999999999999 | 0 |
| 0.8631944444444444 | 0 |
| 0.8638888888888889 | 0 |
| 0.8645833333333334 | 0 |
| 0.8652777777777777 | 0 |
| 0.8659722222222223 | 0 |
| 0.8666666666666667 | 0 |
| 0.8673611111111111 | 0 |
| 0.8680555555555555 | 0 |
| 0.86875 | 0 |
| 0.8694444444444445 | 0 |
| 0.8701388888888889 | 0 |
| 0.8708333333333332 | 0 |
| 0.8715277777777778 | 0 |
| 0.8722222222222222 | 0 |
| 0.8729166666666667 | 0 |
| 0.873611111111111 | 0 |
| 0.8743055555555556 | 0 |
| 0.875 | 0 |
| 0.8756944444444444 | 0 |
| 0.876388888888889 | 0 |
| 0.8770833333333333 | 0 |
| 0.8777777777777778 | 0 |
| 0.8784722222222222 | 0 |
| 0.8791666666666668 | 0 |
| 0.8798611111111111 | 0 |
| 0.8805555555555555 | 0 |
| 0.88125 | 0 |
| 0.8819444444444445 | 0 |
| 0.8826388888888889 | 0 |
| 0.8833333333333333 | 0 |
| 0.8840277777777777 | 0 |
| 0.8847222222222223 | 0 |
| 0.8854166666666666 | 0 |
| 0.8861111111111111 | 0 |
| 0.8868055555555556 | 0 |
| 0.8875000000000001 | 0 |
| 0.8881944444444444 | 0 |
| 0.8888888888888888 | 0 |
| 0.8895833333333334 | 0 |
| 0.8902777777777778 | 0 |
| 0.8909722222222222 | 0 |
| 0.8916666666666666 | 0 |
| 0.8923611111111112 | 0 |
| 0.8930555555555556 | 0 |
| 0.8937499999999999 | 0 |
| 0.8944444444444444 | 0 |
| 0.8951388888888889 | 0 |
| 0.8958333333333334 | 0 |
| 0.8965277777777777 | 0 |
| 0.8972222222222223 | 0 |
| 0.8979166666666667 | 0 |
| 0.8986111111111111 | 0 |
| 0.8993055555555555 | 0 |
| 0.9 | 0 |
| 0.9006944444444445 | 0 |
| 0.9013888888888889 | 0 |
| 0.9020833333333332 | 0 |
| 0.9027777777777778 | 0 |
| 0.9034722222222222 | 0 |
| 0.9041666666666667 | 0 |
| 0.904861111111111 | 0 |
| 0.9055555555555556 | 0 |
| 0.90625 | 0 |
| 0.9069444444444444 | 0 |
| 0.907638888888889 | 0 |
| 0.9083333333333333 | 0 |
| 0.9090277777777778 | 0 |
| 0.9097222222222222 | 0 |
| 0.9104166666666668 | 0 |
| 0.9111111111111111 | 0 |
| 0.9118055555555555 | 0 |
| 0.9125 | 0 |
| 0.9131944444444445 | 0 |
| 0.9138888888888889 | 0 |
| 0.9145833333333333 | 0 |
| 0.9152777777777777 | 0 |
| 0.9159722222222223 | 0 |
| 0.9166666666666666 | 0 |
| 0.9173611111111111 | 0 |
| 0.9180555555555556 | 0 |
| 0.9187500000000001 | 0 |
| 0.9194444444444444 | 0 |
| 0.9201388888888888 | 0 |
| 0.9208333333333334 | 0 |
| 0.9215277777777778 | 0 |
| 0.9222222222222222 | 0 |
| 0.9229166666666666 | 0 |
| 0.9236111111111112 | 0 |
| 0.9243055555555556 | 0 |
| 0.9249999999999999 | 0 |
| 0.9256944444444444 | 0 |
| 0.9263888888888889 | 0 |
| 0.9270833333333334 | 0 |
| 0.9277777777777777 | 0 |
| 0.9284722222222223 | 0 |
| 0.9291666666666667 | 0 |
| 0.9298611111111111 | 0 |
| 0.9305555555555555 | 0 |
| 0.93125 | 0 |
| 0.9319444444444445 | 0 |
| 0.9326388888888889 | 0 |
| 0.9333333333333332 | 0 |
| 0.9340277777777778 | 0 |
| 0.9347222222222222 | 0 |
| 0.9354166666666667 | 0 |
| 0.936111111111111 | 0 |
| 0.9368055555555556 | 0 |
| 0.9375 | 0 |
| 0.9381944444444444 | 0 |
| 0.938888888888889 | 0 |
| 0.9395833333333333 | 0 |
| 0.9402777777777778 | 0 |
| 0.9409722222222222 | 0 |
| 0.9416666666666668 | 0 |
| 0.9423611111111111 | 0 |
| 0.9430555555555555 | 0 |
| 0.94375 | 0 |
| 0.9444444444444445 | 0 |
| 0.9451388888888889 | 0 |
| 0.9458333333333333 | 0 |
| 0.9465277777777777 | 0 |
| 0.9472222222222223 | 0 |
| 0.9479166666666666 | 0 |
| 0.9486111111111111 | 0 |
| 0.9493055555555556 | 0 |
| 0.9500000000000001 | 0 |
| 0.9506944444444444 | 0 |
| 0.9513888888888888 | 0 |
| 0.9520833333333334 | 0 |
| 0.9527777777777778 | 0 |
| 0.9534722222222222 | 0 |
| 0.9541666666666666 | 0 |
| 0.9548611111111112 | 0 |
| 0.9555555555555556 | 0 |
| 0.9562499999999999 | 0 |
| 0.9569444444444444 | 0 |
| 0.9576388888888889 | 0 |
| 0.9583333333333334 | 0 |
| 0.9590277777777777 | 0 |
| 0.9597222222222223 | 0 |
| 0.9604166666666667 | 0 |
| 0.9611111111111111 | 0 |
| 0.9618055555555555 | 0 |
| 0.9625 | 0 |
| 0.9631944444444445 | 0 |
| 0.9638888888888889 | 0 |
| 0.9645833333333332 | 0 |
| 0.9652777777777778 | 0 |
| 0.9659722222222222 | 0 |
| 0.9666666666666667 | 0 |
| 0.967361111111111 | 0 |
| 0.9680555555555556 | 0 |
| 0.96875 | 0 |
| 0.9694444444444444 | 0 |
| 0.970138888888889 | 0 |
| 0.9708333333333333 | 0 |
| 0.9715277777777778 | 0 |
| 0.9722222222222222 | 0 |
| 0.9729166666666668 | 0 |
| 0.9736111111111111 | 0 |
| 0.9743055555555555 | 0 |
| 0.975 | 0 |
| 0.9756944444444445 | 0 |
| 0.9763888888888889 | 0 |
| 0.9770833333333333 | 0 |
| 0.9777777777777777 | 0 |
| 0.9784722222222223 | 0 |
| 0.9791666666666666 | 0 |
| 0.9798611111111111 | 0 |
| 0.9805555555555556 | 0 |
| 0.9812500000000001 | 0 |
| 0.9819444444444444 | 0 |
| 0.9826388888888888 | 0 |
| 0.9833333333333334 | 0 |
| 0.9840277777777778 | 0 |
| 0.9847222222222222 | 0 |
| 0.9854166666666666 | 0 |
| 0.9861111111111112 | 0 |
| 0.9868055555555556 | 0 |
| 0.9874999999999999 | 0 |
| 0.9881944444444444 | 0 |
| 0.9888888888888889 | 0 |
| 0.9895833333333334 | 0 |
| 0.9902777777777777 | 0 |
| 0.9909722222222223 | 0 |
| 0.9916666666666667 | 0 |
| 0.9923611111111111 | 0 |
| 0.9930555555555555 | 0 |
| 0.99375 | 0 |
| 0.9944444444444445 | 0 |
| 0.9951388888888889 | 0 |
| 0.9958333333333332 | 0 |
| 0.9965277777777778 | 0 |
| 0.9972222222222222 | 0 |
| 0.9979166666666667 | 0 |
| 0.998611111111111 | 0 |
| 0.9993055555555556 | 0 |